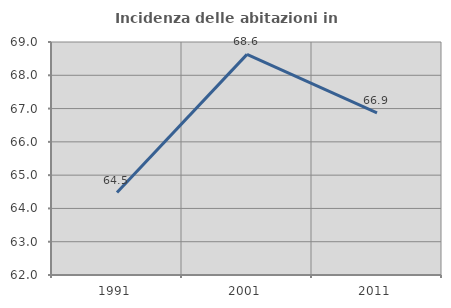
| Category | Incidenza delle abitazioni in proprietà  |
|---|---|
| 1991.0 | 64.477 |
| 2001.0 | 68.627 |
| 2011.0 | 66.871 |